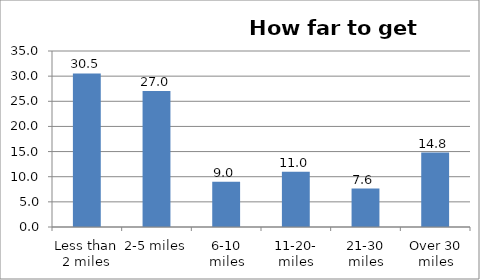
| Category | Series 0 |
|---|---|
| Less than 2 miles | 30.529 |
| 2-5 miles | 27.022 |
| 6-10 miles | 8.999 |
| 11-20- miles | 10.999 |
| 21-30 miles | 7.647 |
| Over 30 miles | 14.804 |